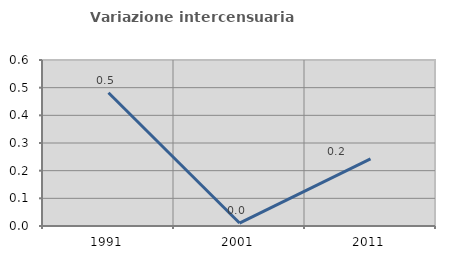
| Category | Variazione intercensuaria annua |
|---|---|
| 1991.0 | 0.482 |
| 2001.0 | 0.011 |
| 2011.0 | 0.242 |